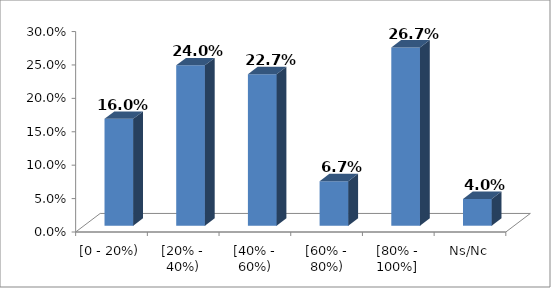
| Category | % |
|---|---|
| [0 - 20%) | 0.16 |
| [20% - 40%) | 0.24 |
| [40% - 60%) | 0.227 |
| [60% - 80%) | 0.067 |
| [80% - 100%] | 0.267 |
| Ns/Nc | 0.04 |